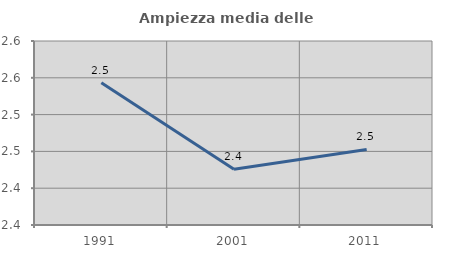
| Category | Ampiezza media delle famiglie |
|---|---|
| 1991.0 | 2.543 |
| 2001.0 | 2.426 |
| 2011.0 | 2.453 |